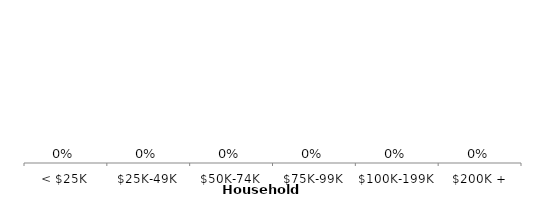
| Category | Series 0 |
|---|---|
| < $25K | 0 |
| $25K-49K | 0 |
| $50K-74K | 0 |
| $75K-99K | 0 |
| $100K-199K | 0 |
| $200K + | 0 |